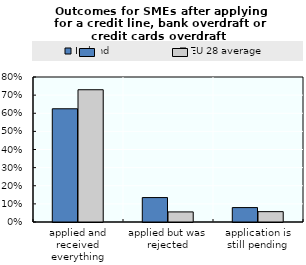
| Category | Ireland | EU 28 average |
|---|---|---|
| applied and received everything | 0.625 | 0.73 |
| applied but was rejected | 0.135 | 0.056 |
| application is still pending | 0.08 | 0.057 |